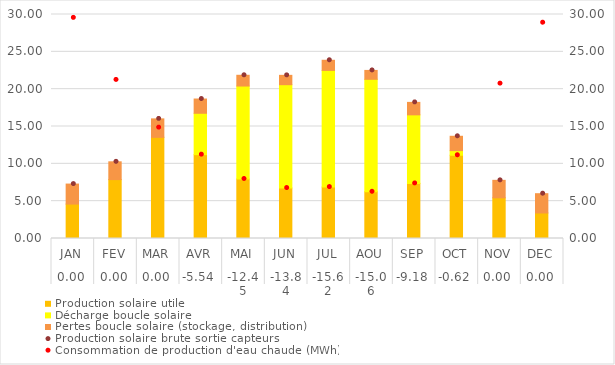
| Category | Production solaire utile | Décharge boucle solaire | Pertes boucle solaire (stockage, distribution) |
|---|---|---|---|
| 0 | 4.61 | 0 | 2.68 |
| 1 | 7.89 | 0 | 2.38 |
| 2 | 13.55 | 0 | 2.47 |
| 3 | 11.23 | 5.54 | 1.91 |
| 4 | 7.97 | 12.45 | 1.44 |
| 5 | 6.76 | 13.84 | 1.25 |
| 6 | 6.89 | 15.62 | 1.36 |
| 7 | 6.26 | 15.06 | 1.19 |
| 8 | 7.38 | 9.18 | 1.67 |
| 9 | 11.15 | 0.62 | 1.92 |
| 10 | 5.45 | 0 | 2.34 |
| 11 | 3.42 | 0 | 2.58 |